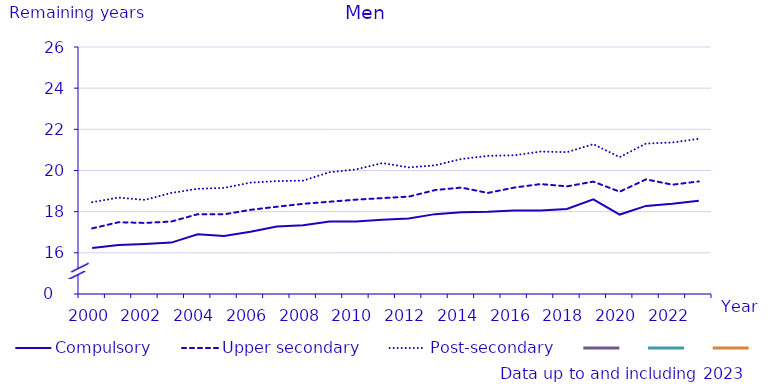
| Category | Compulsory | Upper secondary | Post-secondary | #REFERENS! |
|---|---|---|---|---|
| 2000.0 | 16.235 | 17.187 | 18.462 | 0 |
| 2001.0 | 16.382 | 17.487 | 18.686 | 0 |
| 2002.0 | 16.431 | 17.452 | 18.571 | 0 |
| 2003.0 | 16.497 | 17.521 | 18.91 | 0 |
| 2004.0 | 16.902 | 17.875 | 19.111 | 0 |
| 2005.0 | 16.817 | 17.87 | 19.157 | 0 |
| 2006.0 | 17.022 | 18.089 | 19.41 | 0 |
| 2007.0 | 17.28 | 18.24 | 19.485 | 0 |
| 2008.0 | 17.342 | 18.382 | 19.509 | 0 |
| 2009.0 | 17.518 | 18.483 | 19.918 | 0 |
| 2010.0 | 17.52 | 18.583 | 20.052 | 0 |
| 2011.0 | 17.607 | 18.659 | 20.362 | 0 |
| 2012.0 | 17.67 | 18.73 | 20.15 | 0 |
| 2013.0 | 17.88 | 19.05 | 20.25 | 0 |
| 2014.0 | 17.97 | 19.17 | 20.56 | 0 |
| 2015.0 | 18 | 18.91 | 20.71 | 0 |
| 2016.0 | 18.06 | 19.17 | 20.74 | 0 |
| 2017.0 | 18.06 | 19.34 | 20.92 | 0 |
| 2018.0 | 18.13 | 19.23 | 20.89 | 0 |
| 2019.0 | 18.6 | 19.46 | 21.28 | 0 |
| 2020.0 | 17.86 | 18.97 | 20.65 | 0 |
| 2021.0 | 18.28 | 19.57 | 21.31 | 0 |
| 2022.0 | 18.38 | 19.31 | 21.36 | 0 |
| 2023.0 | 18.53 | 19.47 | 21.54 | 0 |